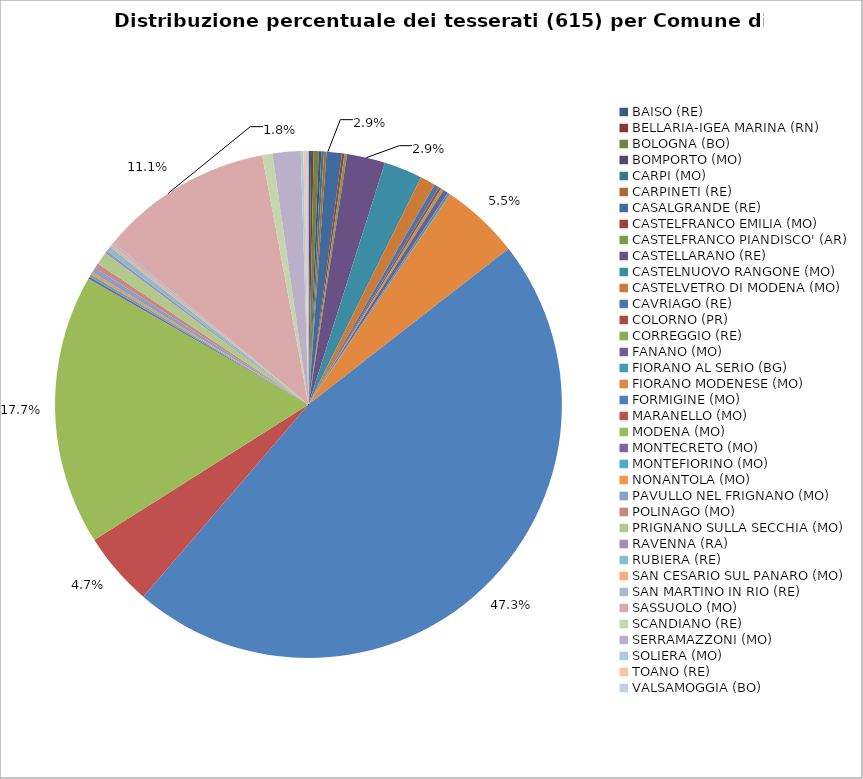
| Category | Nr. Tesserati |
|---|---|
| BAISO (RE) | 1 |
| BELLARIA-IGEA MARINA (RN) | 1 |
| BOLOGNA (BO) | 2 |
| BOMPORTO (MO) | 1 |
| CARPI (MO) | 1 |
| CARPINETI (RE) | 1 |
| CASALGRANDE (RE) | 6 |
| CASTELFRANCO EMILIA (MO) | 1 |
| CASTELFRANCO PIANDISCO' (AR) | 1 |
| CASTELLARANO (RE) | 15 |
| CASTELNUOVO RANGONE (MO) | 15 |
| CASTELVETRO DI MODENA (MO) | 6 |
| CAVRIAGO (RE) | 2 |
| COLORNO (PR) | 1 |
| CORREGGIO (RE) | 1 |
| FANANO (MO) | 2 |
| FIORANO AL SERIO (BG) | 1 |
| FIORANO MODENESE (MO) | 31 |
| FORMIGINE (MO) | 288 |
| MARANELLO (MO) | 29 |
| MODENA (MO) | 106 |
| MONTECRETO (MO) | 1 |
| MONTEFIORINO (MO) | 1 |
| NONANTOLA (MO) | 1 |
| PAVULLO NEL FRIGNANO (MO) | 2 |
| POLINAGO (MO) | 2 |
| PRIGNANO SULLA SECCHIA (MO) | 5 |
| RAVENNA (RA) | 1 |
| RUBIERA (RE) | 2 |
| SAN CESARIO SUL PANARO (MO) | 1 |
| SAN MARTINO IN RIO (RE) | 1 |
| SASSUOLO (MO) | 68 |
| SCANDIANO (RE) | 4 |
| SERRAMAZZONI (MO) | 11 |
| SOLIERA (MO) | 1 |
| TOANO (RE) | 1 |
| VALSAMOGGIA (BO) | 1 |